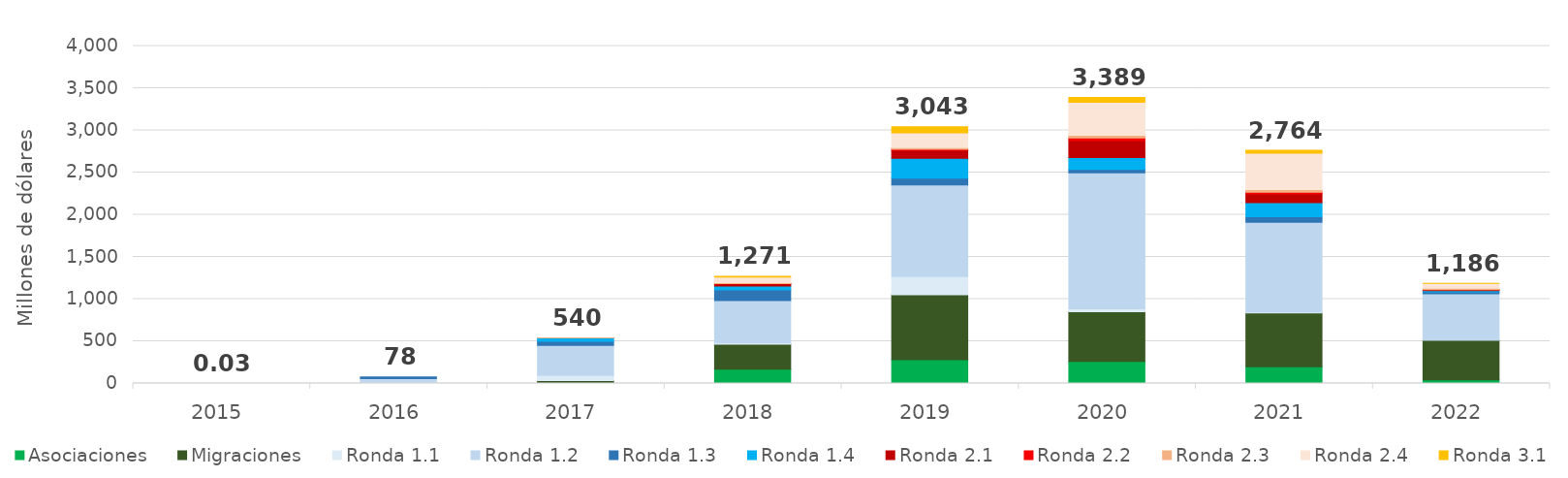
| Category | Asociaciones | Migraciones | Ronda 1.1 | Ronda 1.2 | Ronda 1.3 | Ronda 1.4 | Ronda 2.1 | Ronda 2.2 | Ronda 2.3 | Ronda 2.4 | Ronda 3.1 |
|---|---|---|---|---|---|---|---|---|---|---|---|
| 2015.0 | 0 | 0 | 0.023 | 0.003 | 0 | 0 | 0 | 0 | 0 | 0 | 0 |
| 2016.0 | 0 | 0 | 7.936 | 50.902 | 19.085 | 0 | 0 | 0 | 0 | 0 | 0 |
| 2017.0 | 1.551 | 32.93 | 60.276 | 356.292 | 49.062 | 38.707 | 0.93 | 0 | 0.096 | 0 | 0 |
| 2018.0 | 168.66 | 295.724 | 16.154 | 501.142 | 126.084 | 47.616 | 26.192 | 2.558 | 10.38 | 66.299 | 10.083 |
| 2019.0 | 280.617 | 772.208 | 213.486 | 1086.442 | 82.07 | 235.595 | 94.075 | 12.535 | 18.891 | 175.703 | 71.663 |
| 2020.0 | 260.987 | 590.016 | 33.998 | 1610.735 | 43.009 | 140.295 | 200.372 | 31.245 | 30.995 | 391.695 | 56.039 |
| 2021.0 | 198.847 | 638.47 | 8.662 | 1065.356 | 64.986 | 167.952 | 103.059 | 20.391 | 32.508 | 430.798 | 33.292 |
| 2022.0 | 42.611 | 472.591 | 0.096 | 547.137 | 23.07 | 14.885 | 10.248 | 0.624 | 17.734 | 57.032 | 0.208 |